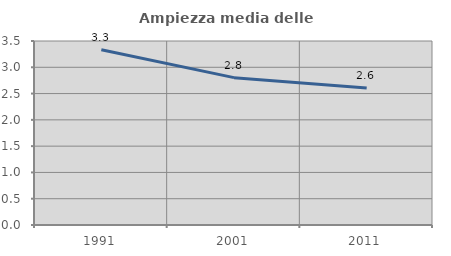
| Category | Ampiezza media delle famiglie |
|---|---|
| 1991.0 | 3.332 |
| 2001.0 | 2.803 |
| 2011.0 | 2.608 |